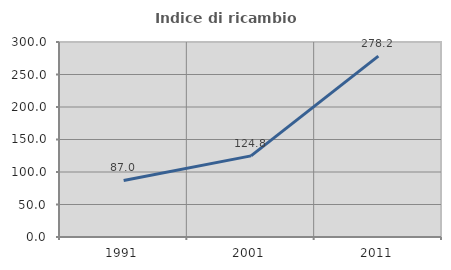
| Category | Indice di ricambio occupazionale  |
|---|---|
| 1991.0 | 86.957 |
| 2001.0 | 124.784 |
| 2011.0 | 278.241 |